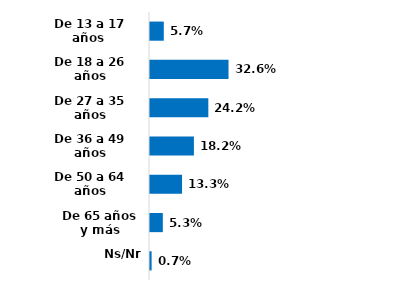
| Category | Series 0 |
|---|---|
| De 13 a 17 años  | 0.057 |
| De 18 a 26 años | 0.326 |
| De 27 a 35 años | 0.242 |
| De 36 a 49 años | 0.182 |
| De 50 a 64 años | 0.133 |
| De 65 años y más | 0.053 |
| Ns/Nr | 0.007 |